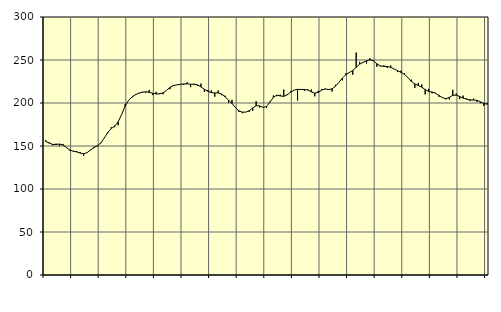
| Category | Piggar | Series 1 |
|---|---|---|
| nan | 156.8 | 155.26 |
| 87.0 | 154.3 | 153.41 |
| 87.0 | 150.8 | 151.91 |
| 87.0 | 152.7 | 151.8 |
| nan | 149.8 | 152.28 |
| 88.0 | 152.4 | 151.2 |
| 88.0 | 147.9 | 148.25 |
| 88.0 | 144.5 | 145.29 |
| nan | 144.4 | 143.92 |
| 89.0 | 144.2 | 143.1 |
| 89.0 | 142.8 | 141.74 |
| 89.0 | 138.8 | 140.97 |
| nan | 142.5 | 142.31 |
| 90.0 | 145.8 | 145.43 |
| 90.0 | 149.2 | 148.23 |
| 90.0 | 149.6 | 150.35 |
| nan | 153.2 | 153.68 |
| 91.0 | 159.7 | 159.4 |
| 91.0 | 164.8 | 165.78 |
| 91.0 | 171.8 | 170.29 |
| nan | 171.9 | 173.19 |
| 92.0 | 174.1 | 178.11 |
| 92.0 | 186.4 | 186.65 |
| 92.0 | 198.6 | 196.1 |
| nan | 203.3 | 203.06 |
| 93.0 | 206.2 | 206.97 |
| 93.0 | 210 | 209.58 |
| 93.0 | 211.8 | 211.34 |
| nan | 212 | 212.65 |
| 94.0 | 212 | 213.04 |
| 94.0 | 215.2 | 212.36 |
| 94.0 | 209.2 | 211.29 |
| nan | 212.9 | 210.49 |
| 95.0 | 211.2 | 210.64 |
| 95.0 | 210.2 | 211.81 |
| 95.0 | 214.6 | 214.59 |
| nan | 216 | 218.09 |
| 96.0 | 219.6 | 220.32 |
| 96.0 | 221.2 | 221.05 |
| 96.0 | 221.5 | 221.63 |
| nan | 220.9 | 222.18 |
| 97.0 | 224.1 | 222.21 |
| 97.0 | 218.4 | 221.85 |
| 97.0 | 222.4 | 221.75 |
| nan | 220.2 | 221.01 |
| 98.0 | 222.6 | 218.71 |
| 98.0 | 213 | 215.97 |
| 98.0 | 215.1 | 213.63 |
| nan | 214.7 | 212.01 |
| 99.0 | 207.4 | 211.71 |
| 99.0 | 214.5 | 211.8 |
| 99.0 | 209.1 | 210.44 |
| nan | 208.5 | 207.21 |
| 0.0 | 200.4 | 203.34 |
| 0.0 | 203.6 | 199.32 |
| 0.0 | 195 | 194.69 |
| nan | 189.6 | 190.92 |
| 1.0 | 188.1 | 189.34 |
| 1.0 | 189.3 | 189.43 |
| 1.0 | 189.6 | 191.1 |
| nan | 190.8 | 194.32 |
| 2.0 | 202 | 196.85 |
| 2.0 | 194.7 | 196.7 |
| 2.0 | 195.3 | 194.89 |
| nan | 194.2 | 195.93 |
| 3.0 | 201.6 | 201.01 |
| 3.0 | 208.7 | 206.61 |
| 3.0 | 207.9 | 209.14 |
| nan | 209.6 | 208.24 |
| 4.0 | 215.6 | 207.68 |
| 4.0 | 210.5 | 209.52 |
| 4.0 | 214 | 212.63 |
| nan | 215 | 215.05 |
| 5.0 | 203 | 215.85 |
| 5.0 | 216.2 | 215.75 |
| 5.0 | 213.9 | 215.72 |
| nan | 215.7 | 215.07 |
| 6.0 | 215.7 | 213.04 |
| 6.0 | 207.7 | 211.53 |
| 6.0 | 214.2 | 212.37 |
| nan | 216.3 | 215.06 |
| 7.0 | 216.8 | 216.28 |
| 7.0 | 216 | 215.62 |
| 7.0 | 213.3 | 216.43 |
| nan | 221.2 | 219.5 |
| 8.0 | 224.1 | 224.13 |
| 8.0 | 226.4 | 228.98 |
| 8.0 | 234.5 | 232.95 |
| nan | 235.8 | 235.44 |
| 9.0 | 232.9 | 237.74 |
| 9.0 | 258.7 | 241.49 |
| 9.0 | 247.8 | 245.15 |
| nan | 247.6 | 247.31 |
| 10.0 | 246 | 249.04 |
| 10.0 | 252 | 250.22 |
| 10.0 | 249.8 | 248.94 |
| nan | 242.2 | 245.57 |
| 11.0 | 242.6 | 243.1 |
| 11.0 | 243.7 | 242.53 |
| 11.0 | 240.7 | 242.41 |
| nan | 243.7 | 241.48 |
| 12.0 | 239.4 | 239.55 |
| 12.0 | 236 | 237.58 |
| 12.0 | 237.7 | 235.59 |
| nan | 234.4 | 233.32 |
| 13.0 | 229.4 | 229.6 |
| 13.0 | 227.1 | 225.04 |
| 13.0 | 217.6 | 222.16 |
| nan | 223.4 | 220.41 |
| 14.0 | 221.6 | 218.38 |
| 14.0 | 210 | 215.67 |
| 14.0 | 216.5 | 213.52 |
| nan | 211.2 | 212.77 |
| 15.0 | 211.8 | 211.3 |
| 15.0 | 207.2 | 208.76 |
| 15.0 | 206.8 | 206.27 |
| nan | 204.2 | 204.99 |
| 16.0 | 204.1 | 206.61 |
| 16.0 | 215.3 | 208.85 |
| 16.0 | 210.9 | 209.18 |
| nan | 204.5 | 207.63 |
| 17.0 | 208.6 | 205.66 |
| 17.0 | 205.4 | 204.42 |
| 17.0 | 202.2 | 203.63 |
| nan | 205 | 203.47 |
| 18.0 | 201.3 | 203.15 |
| 18.0 | 199.7 | 201.45 |
| 18.0 | 196.7 | 199.57 |
| nan | 200.1 | 198.54 |